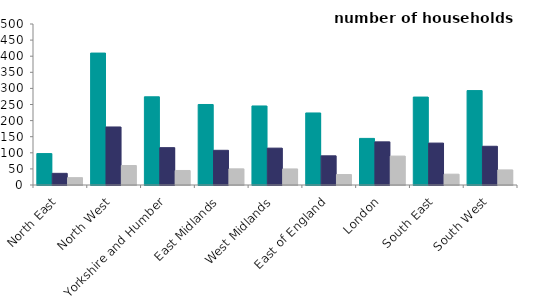
| Category | owner occupied | private rented | social rented |
|---|---|---|---|
| North East | 97.618 | 36.214 | 22.767 |
| North West | 409.717 | 180.236 | 60.555 |
| Yorkshire and Humber | 273.898 | 115.97 | 45.101 |
| East Midlands | 250.048 | 107.743 | 50.149 |
| West Midlands | 245.45 | 114.493 | 49.891 |
| East of England | 223.736 | 90.608 | 32.511 |
| London | 144.741 | 134.001 | 89.783 |
| South East | 273.078 | 130.185 | 33.608 |
| South West | 293.204 | 120.278 | 46.85 |